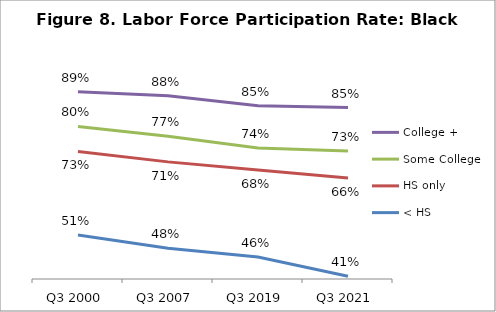
| Category | College + | Some College | HS only | < HS |
|---|---|---|---|---|
| Q3 2000 | 0.888 | 0.798 | 0.733 | 0.515 |
| Q3 2007 | 0.878 | 0.773 | 0.706 | 0.48 |
| Q3 2019 | 0.852 | 0.742 | 0.684 | 0.457 |
| Q3 2021 | 0.847 | 0.734 | 0.663 | 0.407 |